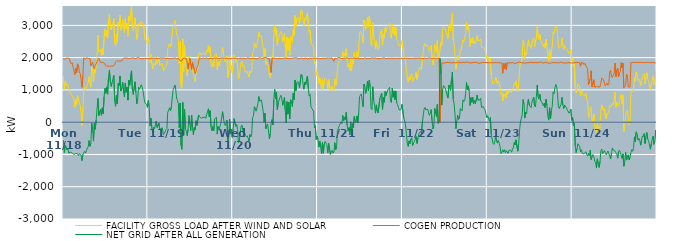
| Category | FACILITY GROSS LOAD AFTER WIND AND SOLAR | COGEN PRODUCTION | NET GRID AFTER ALL GENERATION |
|---|---|---|---|
|  Mon  11/18 | 1417 | 1982 | -565 |
|  Mon  11/18 | 1003 | 1946 | -943 |
|  Mon  11/18 | 1257 | 1965 | -708 |
|  Mon  11/18 | 1280 | 1978 | -698 |
|  Mon  11/18 | 1140 | 2000 | -860 |
|  Mon  11/18 | 1173 | 1989 | -816 |
|  Mon  11/18 | 1040 | 1997 | -957 |
|  Mon  11/18 | 981 | 1967 | -986 |
|  Mon  11/18 | 898 | 1826 | -928 |
|  Mon  11/18 | 855 | 1796 | -941 |
|  Mon  11/18 | 876 | 1833 | -957 |
|  Mon  11/18 | 758 | 1698 | -940 |
|  Mon  11/18 | 679 | 1681 | -1002 |
|  Mon  11/18 | 462 | 1474 | -1012 |
|  Mon  11/18 | 700 | 1665 | -965 |
|  Mon  11/18 | 548 | 1539 | -991 |
|  Mon  11/18 | 828 | 1808 | -980 |
|  Mon  11/18 | 727 | 1765 | -1038 |
|  Mon  11/18 | 574 | 1553 | -979 |
|  Mon  11/18 | 520 | 1503 | -983 |
|  Mon  11/18 | 288 | 1310 | -1022 |
|  Mon  11/18 | -111 | 1080 | -1191 |
|  Mon  11/18 | 454 | 1449 | -995 |
|  Mon  11/18 | 999 | 1995 | -996 |
|  Mon  11/18 | 1068 | 1970 | -902 |
|  Mon  11/18 | 990 | 1948 | -958 |
|  Mon  11/18 | 1125 | 1997 | -872 |
|  Mon  11/18 | 1104 | 1977 | -873 |
|  Mon  11/18 | 1217 | 1976 | -759 |
|  Mon  11/18 | 1414 | 1984 | -570 |
|  Mon  11/18 | 1230 | 1977 | -747 |
|  Mon  11/18 | 1083 | 1743 | -660 |
|  Mon  11/18 | 1712 | 1739 | -27 |
|  Mon  11/18 | 1621 | 1854 | -233 |
|  Mon  11/18 | 1250 | 1838 | -588 |
|  Mon  11/18 | 1627 | 1651 | -24 |
|  Mon  11/18 | 1528 | 1751 | -223 |
|  Mon  11/18 | 1823 | 1757 | 66 |
|  Mon  11/18 | 1968 | 1877 | 91 |
|  Mon  11/18 | 2692 | 1955 | 737 |
|  Mon  11/18 | 2190 | 1986 | 204 |
|  Mon  11/18 | 2210 | 2000 | 210 |
|  Mon  11/18 | 2239 | 1845 | 394 |
|  Mon  11/18 | 2053 | 1839 | 214 |
|  Mon  11/18 | 2301 | 1855 | 446 |
|  Mon  11/18 | 2085 | 1830 | 255 |
|  Mon  11/18 | 2626 | 1834 | 792 |
|  Mon  11/18 | 2887 | 1832 | 1055 |
|  Mon  11/18 | 2639 | 1745 | 894 |
|  Mon  11/18 | 2841 | 1748 | 1093 |
|  Mon  11/18 | 2601 | 1734 | 867 |
|  Mon  11/18 | 3139 | 1751 | 1388 |
|  Mon  11/18 | 3351 | 1733 | 1618 |
|  Mon  11/18 | 2989 | 1744 | 1245 |
|  Mon  11/18 | 2852 | 1744 | 1108 |
|  Mon  11/18 | 2975 | 1748 | 1227 |
|  Mon  11/18 | 3071 | 1737 | 1334 |
|  Mon  11/18 | 3208 | 1759 | 1449 |
|  Mon  11/18 | 2450 | 1786 | 664 |
|  Mon  11/18 | 2361 | 1868 | 493 |
|  Mon  11/18 | 2737 | 1901 | 836 |
|  Mon  11/18 | 2457 | 1893 | 564 |
|  Mon  11/18 | 3098 | 1896 | 1202 |
|  Mon  11/18 | 3027 | 1892 | 1135 |
|  Mon  11/18 | 3323 | 1890 | 1433 |
|  Mon  11/18 | 2852 | 1887 | 965 |
|  Mon  11/18 | 2943 | 1895 | 1048 |
|  Mon  11/18 | 3191 | 1948 | 1243 |
|  Mon  11/18 | 2927 | 1984 | 943 |
|  Mon  11/18 | 2778 | 1991 | 787 |
|  Mon  11/18 | 3205 | 1990 | 1215 |
|  Mon  11/18 | 2895 | 1968 | 927 |
|  Mon  11/18 | 3071 | 1982 | 1089 |
|  Mon  11/18 | 2664 | 1981 | 683 |
|  Mon  11/18 | 3279 | 1974 | 1305 |
|  Mon  11/18 | 3134 | 1986 | 1148 |
|  Mon  11/18 | 3116 | 1979 | 1137 |
|  Mon  11/18 | 3580 | 1988 | 1592 |
|  Mon  11/18 | 2981 | 1995 | 986 |
|  Mon  11/18 | 2840 | 1981 | 859 |
|  Mon  11/18 | 2868 | 1982 | 886 |
|  Mon  11/18 | 3238 | 1987 | 1251 |
|  Mon  11/18 | 2894 | 1971 | 923 |
|  Mon  11/18 | 2559 | 1989 | 570 |
|  Mon  11/18 | 2720 | 2010 | 710 |
|  Mon  11/18 | 3063 | 1985 | 1078 |
|  Mon  11/18 | 3001 | 1980 | 1021 |
|  Mon  11/18 | 2979 | 1980 | 999 |
|  Mon  11/18 | 3130 | 1970 | 1160 |
|  Mon  11/18 | 3083 | 1996 | 1087 |
|  Mon  11/18 | 2940 | 1966 | 974 |
|  Mon  11/18 | 2993 | 1993 | 1000 |
|  Mon  11/18 | 2583 | 1976 | 607 |
|  Mon  11/18 | 2591 | 1984 | 607 |
|  Mon  11/18 | 2517 | 1970 | 547 |
|  Mon  11/18 | 2431 | 1973 | 458 |
|  Tue  11/19 | 2643 | 1976 | 667 |
|  Tue  11/19 | 2469 | 1976 | 493 |
|  Tue  11/19 | 1847 | 1963 | -116 |
|  Tue  11/19 | 2102 | 1978 | 124 |
|  Tue  11/19 | 1813 | 1981 | -168 |
|  Tue  11/19 | 1646 | 1975 | -329 |
|  Tue  11/19 | 1835 | 1990 | -155 |
|  Tue  11/19 | 1784 | 1985 | -201 |
|  Tue  11/19 | 1752 | 1977 | -225 |
|  Tue  11/19 | 2026 | 1989 | 37 |
|  Tue  11/19 | 1810 | 1975 | -165 |
|  Tue  11/19 | 1840 | 1979 | -139 |
|  Tue  11/19 | 1951 | 1980 | -29 |
|  Tue  11/19 | 1748 | 1984 | -236 |
|  Tue  11/19 | 1795 | 1991 | -196 |
|  Tue  11/19 | 1793 | 1994 | -201 |
|  Tue  11/19 | 1815 | 1990 | -175 |
|  Tue  11/19 | 1585 | 1973 | -388 |
|  Tue  11/19 | 1598 | 1990 | -392 |
|  Tue  11/19 | 1688 | 1980 | -292 |
|  Tue  11/19 | 1741 | 1974 | -233 |
|  Tue  11/19 | 1772 | 1970 | -198 |
|  Tue  11/19 | 2287 | 1976 | 311 |
|  Tue  11/19 | 2351 | 1981 | 370 |
|  Tue  11/19 | 2424 | 1978 | 446 |
|  Tue  11/19 | 2327 | 1975 | 352 |
|  Tue  11/19 | 2444 | 1977 | 467 |
|  Tue  11/19 | 2457 | 1991 | 466 |
|  Tue  11/19 | 2972 | 1980 | 992 |
|  Tue  11/19 | 3050 | 1990 | 1060 |
|  Tue  11/19 | 3149 | 1996 | 1153 |
|  Tue  11/19 | 2999 | 1978 | 1021 |
|  Tue  11/19 | 2718 | 1971 | 747 |
|  Tue  11/19 | 2649 | 1977 | 672 |
|  Tue  11/19 | 2571 | 1985 | 586 |
|  Tue  11/19 | 1815 | 1987 | -172 |
|  Tue  11/19 | 2493 | 1901 | 592 |
|  Tue  11/19 | 1156 | 1872 | -716 |
|  Tue  11/19 | 1054 | 1896 | -842 |
|  Tue  11/19 | 2581 | 1969 | 612 |
|  Tue  11/19 | 1564 | 1974 | -410 |
|  Tue  11/19 | 2385 | 1981 | 404 |
|  Tue  11/19 | 1775 | 1977 | -202 |
|  Tue  11/19 | 1698 | 1978 | -280 |
|  Tue  11/19 | 1425 | 1841 | -416 |
|  Tue  11/19 | 1420 | 1644 | -224 |
|  Tue  11/19 | 2051 | 1847 | 204 |
|  Tue  11/19 | 1933 | 1982 | -49 |
|  Tue  11/19 | 1727 | 1990 | -263 |
|  Tue  11/19 | 1857 | 1638 | 219 |
|  Tue  11/19 | 1686 | 1846 | -160 |
|  Tue  11/19 | 1464 | 1848 | -384 |
|  Tue  11/19 | 1461 | 1626 | -165 |
|  Tue  11/19 | 1263 | 1502 | -239 |
|  Tue  11/19 | 1627 | 1583 | 44 |
|  Tue  11/19 | 1599 | 1697 | -98 |
|  Tue  11/19 | 1655 | 1746 | -91 |
|  Tue  11/19 | 2117 | 1893 | 224 |
|  Tue  11/19 | 2163 | 1996 | 167 |
|  Tue  11/19 | 2133 | 1989 | 144 |
|  Tue  11/19 | 2088 | 1969 | 119 |
|  Tue  11/19 | 2134 | 1995 | 139 |
|  Tue  11/19 | 2140 | 1992 | 148 |
|  Tue  11/19 | 2139 | 1990 | 149 |
|  Tue  11/19 | 2135 | 1976 | 159 |
|  Tue  11/19 | 2083 | 1964 | 119 |
|  Tue  11/19 | 2220 | 1988 | 232 |
|  Tue  11/19 | 2184 | 1969 | 215 |
|  Tue  11/19 | 2391 | 1975 | 416 |
|  Tue  11/19 | 2154 | 1988 | 166 |
|  Tue  11/19 | 2336 | 1979 | 357 |
|  Tue  11/19 | 1829 | 1980 | -151 |
|  Tue  11/19 | 1714 | 1978 | -264 |
|  Tue  11/19 | 1841 | 1978 | -137 |
|  Tue  11/19 | 1721 | 1983 | -262 |
|  Tue  11/19 | 2073 | 1983 | 90 |
|  Tue  11/19 | 2098 | 1987 | 111 |
|  Tue  11/19 | 2136 | 1980 | 156 |
|  Tue  11/19 | 1615 | 1985 | -370 |
|  Tue  11/19 | 1855 | 1983 | -128 |
|  Tue  11/19 | 1744 | 1971 | -227 |
|  Tue  11/19 | 1839 | 1978 | -139 |
|  Tue  11/19 | 1942 | 1984 | -42 |
|  Tue  11/19 | 2135 | 1988 | 147 |
|  Tue  11/19 | 2316 | 1992 | 324 |
|  Tue  11/19 | 2107 | 1976 | 131 |
|  Tue  11/19 | 1947 | 1982 | -35 |
|  Tue  11/19 | 1872 | 1975 | -103 |
|  Tue  11/19 | 1878 | 1984 | -106 |
|  Tue  11/19 | 2052 | 1991 | 61 |
|  Tue  11/19 | 1368 | 1973 | -605 |
|  Tue  11/19 | 1545 | 1993 | -448 |
|  Tue  11/19 | 2067 | 1969 | 98 |
|  Tue  11/19 | 1623 | 1980 | -357 |
|  Tue  11/19 | 1749 | 1974 | -225 |
|  Tue  11/19 | 1526 | 1996 | -470 |
|  Wed  11/20 | 1787 | 1986 | -199 |
|  Wed  11/20 | 2086 | 1974 | 112 |
|  Wed  11/20 | 2078 | 1976 | 102 |
|  Wed  11/20 | 1860 | 1992 | -132 |
|  Wed  11/20 | 1918 | 1987 | -69 |
|  Wed  11/20 | 1767 | 1995 | -228 |
|  Wed  11/20 | 1337 | 1971 | -634 |
|  Wed  11/20 | 1385 | 1971 | -586 |
|  Wed  11/20 | 1664 | 1986 | -322 |
|  Wed  11/20 | 1847 | 1977 | -130 |
|  Wed  11/20 | 1891 | 1978 | -87 |
|  Wed  11/20 | 1709 | 1975 | -266 |
|  Wed  11/20 | 1752 | 1985 | -233 |
|  Wed  11/20 | 1766 | 1974 | -208 |
|  Wed  11/20 | 1549 | 1964 | -415 |
|  Wed  11/20 | 1527 | 1982 | -455 |
|  Wed  11/20 | 1573 | 1995 | -422 |
|  Wed  11/20 | 1586 | 1980 | -394 |
|  Wed  11/20 | 1399 | 1985 | -586 |
|  Wed  11/20 | 1591 | 1975 | -384 |
|  Wed  11/20 | 1523 | 1974 | -451 |
|  Wed  11/20 | 1607 | 1968 | -361 |
|  Wed  11/20 | 2119 | 1974 | 145 |
|  Wed  11/20 | 2187 | 1987 | 200 |
|  Wed  11/20 | 2458 | 1980 | 478 |
|  Wed  11/20 | 2377 | 1969 | 408 |
|  Wed  11/20 | 2305 | 1965 | 340 |
|  Wed  11/20 | 2314 | 1970 | 344 |
|  Wed  11/20 | 2539 | 1973 | 566 |
|  Wed  11/20 | 2783 | 1988 | 795 |
|  Wed  11/20 | 2657 | 2004 | 653 |
|  Wed  11/20 | 2660 | 1988 | 672 |
|  Wed  11/20 | 2666 | 1977 | 689 |
|  Wed  11/20 | 2658 | 1985 | 673 |
|  Wed  11/20 | 2308 | 1983 | 325 |
|  Wed  11/20 | 1971 | 1969 | 2 |
|  Wed  11/20 | 2280 | 2005 | 275 |
|  Wed  11/20 | 1790 | 1993 | -203 |
|  Wed  11/20 | 1884 | 1998 | -114 |
|  Wed  11/20 | 1907 | 1967 | -60 |
|  Wed  11/20 | 1705 | 1975 | -270 |
|  Wed  11/20 | 1449 | 1967 | -518 |
|  Wed  11/20 | 1374 | 1736 | -362 |
|  Wed  11/20 | 1533 | 1542 | -9 |
|  Wed  11/20 | 2056 | 1976 | 80 |
|  Wed  11/20 | 1906 | 1994 | -88 |
|  Wed  11/20 | 2678 | 1985 | 693 |
|  Wed  11/20 | 2999 | 1981 | 1018 |
|  Wed  11/20 | 2694 | 1975 | 719 |
|  Wed  11/20 | 2903 | 1976 | 927 |
|  Wed  11/20 | 2361 | 1976 | 385 |
|  Wed  11/20 | 2574 | 1970 | 604 |
|  Wed  11/20 | 2568 | 1980 | 588 |
|  Wed  11/20 | 2753 | 1985 | 768 |
|  Wed  11/20 | 2808 | 1974 | 834 |
|  Wed  11/20 | 2740 | 1990 | 750 |
|  Wed  11/20 | 2500 | 1979 | 521 |
|  Wed  11/20 | 2629 | 1986 | 643 |
|  Wed  11/20 | 2751 | 1985 | 766 |
|  Wed  11/20 | 2341 | 1985 | 356 |
|  Wed  11/20 | 1964 | 1982 | -18 |
|  Wed  11/20 | 2641 | 2004 | 637 |
|  Wed  11/20 | 2222 | 1975 | 247 |
|  Wed  11/20 | 2601 | 1979 | 622 |
|  Wed  11/20 | 2073 | 1975 | 98 |
|  Wed  11/20 | 2665 | 1970 | 695 |
|  Wed  11/20 | 2613 | 1980 | 633 |
|  Wed  11/20 | 2455 | 1975 | 480 |
|  Wed  11/20 | 2884 | 1983 | 901 |
|  Wed  11/20 | 2686 | 1985 | 701 |
|  Wed  11/20 | 3303 | 1998 | 1305 |
|  Wed  11/20 | 2963 | 1985 | 978 |
|  Wed  11/20 | 3215 | 1995 | 1220 |
|  Wed  11/20 | 3256 | 1995 | 1261 |
|  Wed  11/20 | 3191 | 1967 | 1224 |
|  Wed  11/20 | 3052 | 1980 | 1072 |
|  Wed  11/20 | 3045 | 1980 | 1065 |
|  Wed  11/20 | 3479 | 1992 | 1487 |
|  Wed  11/20 | 3436 | 1983 | 1453 |
|  Wed  11/20 | 3174 | 1976 | 1198 |
|  Wed  11/20 | 2991 | 1969 | 1022 |
|  Wed  11/20 | 3224 | 1981 | 1243 |
|  Wed  11/20 | 3150 | 1990 | 1160 |
|  Wed  11/20 | 3165 | 1996 | 1169 |
|  Wed  11/20 | 3387 | 1959 | 1428 |
|  Wed  11/20 | 3046 | 1984 | 1062 |
|  Wed  11/20 | 2785 | 1976 | 809 |
|  Wed  11/20 | 2852 | 1990 | 862 |
|  Wed  11/20 | 2456 | 1981 | 475 |
|  Wed  11/20 | 2403 | 1977 | 426 |
|  Wed  11/20 | 2413 | 1981 | 432 |
|  Wed  11/20 | 2316 | 1979 | 337 |
|  Wed  11/20 | 1806 | 1988 | -182 |
|  Wed  11/20 | 1871 | 1983 | -112 |
|  Wed  11/20 | 1442 | 1978 | -536 |
|  Wed  11/20 | 1564 | 1996 | -432 |
|  Thu  11/21 | 1451 | 1984 | -533 |
|  Thu  11/21 | 1200 | 1971 | -771 |
|  Thu  11/21 | 1379 | 1973 | -594 |
|  Thu  11/21 | 1204 | 1964 | -760 |
|  Thu  11/21 | 1004 | 1973 | -969 |
|  Thu  11/21 | 1338 | 1970 | -632 |
|  Thu  11/21 | 1024 | 1986 | -962 |
|  Thu  11/21 | 1294 | 1970 | -676 |
|  Thu  11/21 | 1378 | 1976 | -598 |
|  Thu  11/21 | 1382 | 1970 | -588 |
|  Thu  11/21 | 1293 | 1988 | -695 |
|  Thu  11/21 | 1032 | 1981 | -949 |
|  Thu  11/21 | 1333 | 1985 | -652 |
|  Thu  11/21 | 1338 | 1984 | -646 |
|  Thu  11/21 | 993 | 1988 | -995 |
|  Thu  11/21 | 1041 | 1978 | -937 |
|  Thu  11/21 | 1115 | 1989 | -874 |
|  Thu  11/21 | 1009 | 1966 | -957 |
|  Thu  11/21 | 956 | 1882 | -926 |
|  Thu  11/21 | 1347 | 1982 | -635 |
|  Thu  11/21 | 1133 | 1985 | -852 |
|  Thu  11/21 | 1210 | 1970 | -760 |
|  Thu  11/21 | 1705 | 1962 | -257 |
|  Thu  11/21 | 1820 | 2004 | -184 |
|  Thu  11/21 | 1874 | 1985 | -111 |
|  Thu  11/21 | 1941 | 1995 | -54 |
|  Thu  11/21 | 1982 | 1979 | 3 |
|  Thu  11/21 | 1921 | 1968 | -47 |
|  Thu  11/21 | 2185 | 1976 | 209 |
|  Thu  11/21 | 2030 | 1985 | 45 |
|  Thu  11/21 | 2127 | 1976 | 151 |
|  Thu  11/21 | 2054 | 1986 | 68 |
|  Thu  11/21 | 2279 | 1970 | 309 |
|  Thu  11/21 | 1889 | 1994 | -105 |
|  Thu  11/21 | 1717 | 1992 | -275 |
|  Thu  11/21 | 1811 | 1980 | -169 |
|  Thu  11/21 | 1594 | 1983 | -389 |
|  Thu  11/21 | 1994 | 1984 | 10 |
|  Thu  11/21 | 1601 | 1980 | -379 |
|  Thu  11/21 | 1939 | 1982 | -43 |
|  Thu  11/21 | 1806 | 1979 | -173 |
|  Thu  11/21 | 2161 | 1987 | 174 |
|  Thu  11/21 | 2014 | 1966 | 48 |
|  Thu  11/21 | 1973 | 1982 | -9 |
|  Thu  11/21 | 2183 | 1988 | 195 |
|  Thu  11/21 | 1952 | 1960 | -8 |
|  Thu  11/21 | 2261 | 2001 | 260 |
|  Thu  11/21 | 2759 | 1966 | 793 |
|  Thu  11/21 | 2825 | 1988 | 837 |
|  Thu  11/21 | 2853 | 1978 | 875 |
|  Thu  11/21 | 2647 | 1976 | 671 |
|  Thu  11/21 | 2447 | 1967 | 480 |
|  Thu  11/21 | 3164 | 1988 | 1176 |
|  Thu  11/21 | 3108 | 1993 | 1115 |
|  Thu  11/21 | 2875 | 1980 | 895 |
|  Thu  11/21 | 3026 | 1975 | 1051 |
|  Thu  11/21 | 3248 | 1971 | 1277 |
|  Thu  11/21 | 2946 | 1979 | 967 |
|  Thu  11/21 | 3287 | 1984 | 1303 |
|  Thu  11/21 | 3079 | 1975 | 1104 |
|  Thu  11/21 | 2414 | 1988 | 426 |
|  Thu  11/21 | 2382 | 1993 | 389 |
|  Thu  11/21 | 3081 | 1981 | 1100 |
|  Thu  11/21 | 2662 | 1985 | 677 |
|  Thu  11/21 | 2498 | 1979 | 519 |
|  Thu  11/21 | 2268 | 1988 | 280 |
|  Thu  11/21 | 2521 | 1983 | 538 |
|  Thu  11/21 | 2326 | 1975 | 351 |
|  Thu  11/21 | 2251 | 1965 | 286 |
|  Thu  11/21 | 2284 | 1974 | 310 |
|  Thu  11/21 | 2723 | 1976 | 747 |
|  Thu  11/21 | 2712 | 1971 | 741 |
|  Thu  11/21 | 2869 | 1971 | 898 |
|  Thu  11/21 | 2383 | 1985 | 398 |
|  Thu  11/21 | 2734 | 1971 | 763 |
|  Thu  11/21 | 2615 | 1998 | 617 |
|  Thu  11/21 | 2937 | 1985 | 952 |
|  Thu  11/21 | 2790 | 1963 | 827 |
|  Thu  11/21 | 2902 | 1973 | 929 |
|  Thu  11/21 | 2978 | 1980 | 998 |
|  Thu  11/21 | 2963 | 1981 | 982 |
|  Thu  11/21 | 3059 | 1978 | 1081 |
|  Thu  11/21 | 2641 | 1981 | 660 |
|  Thu  11/21 | 2590 | 1982 | 608 |
|  Thu  11/21 | 3038 | 1983 | 1055 |
|  Thu  11/21 | 2751 | 1980 | 771 |
|  Thu  11/21 | 2951 | 1981 | 970 |
|  Thu  11/21 | 2680 | 1981 | 699 |
|  Thu  11/21 | 2954 | 1987 | 967 |
|  Thu  11/21 | 2573 | 1976 | 597 |
|  Thu  11/21 | 2519 | 1975 | 544 |
|  Thu  11/21 | 2431 | 1981 | 450 |
|  Thu  11/21 | 2359 | 1986 | 373 |
|  Thu  11/21 | 2347 | 1980 | 367 |
|  Thu  11/21 | 2364 | 1971 | 393 |
|  Thu  11/21 | 2534 | 1980 | 554 |
|  Fri  11/22 | 2551 | 1974 | 577 |
|  Fri  11/22 | 2110 | 1977 | 133 |
|  Fri  11/22 | 2012 | 1975 | 37 |
|  Fri  11/22 | 1904 | 1981 | -77 |
|  Fri  11/22 | 1616 | 1980 | -364 |
|  Fri  11/22 | 1334 | 1980 | -646 |
|  Fri  11/22 | 1236 | 1986 | -750 |
|  Fri  11/22 | 1401 | 1980 | -579 |
|  Fri  11/22 | 1314 | 1977 | -663 |
|  Fri  11/22 | 1451 | 1975 | -524 |
|  Fri  11/22 | 1498 | 1981 | -483 |
|  Fri  11/22 | 1257 | 1978 | -721 |
|  Fri  11/22 | 1348 | 1992 | -644 |
|  Fri  11/22 | 1377 | 1983 | -606 |
|  Fri  11/22 | 1380 | 1988 | -608 |
|  Fri  11/22 | 1538 | 1981 | -443 |
|  Fri  11/22 | 1318 | 1977 | -659 |
|  Fri  11/22 | 1495 | 1984 | -489 |
|  Fri  11/22 | 1607 | 1981 | -374 |
|  Fri  11/22 | 1675 | 1990 | -315 |
|  Fri  11/22 | 1710 | 1984 | -274 |
|  Fri  11/22 | 1630 | 1972 | -342 |
|  Fri  11/22 | 1950 | 1977 | -27 |
|  Fri  11/22 | 2164 | 1970 | 194 |
|  Fri  11/22 | 2383 | 1982 | 401 |
|  Fri  11/22 | 2444 | 1985 | 459 |
|  Fri  11/22 | 2364 | 1981 | 383 |
|  Fri  11/22 | 2363 | 1975 | 388 |
|  Fri  11/22 | 2392 | 1986 | 406 |
|  Fri  11/22 | 2379 | 1989 | 390 |
|  Fri  11/22 | 2192 | 1980 | 212 |
|  Fri  11/22 | 2273 | 1994 | 279 |
|  Fri  11/22 | 2379 | 1989 | 390 |
|  Fri  11/22 | 2019 | 1968 | 51 |
|  Fri  11/22 | 1775 | 1982 | -207 |
|  Fri  11/22 | 1857 | 1984 | -127 |
|  Fri  11/22 | 2404 | 1976 | 428 |
|  Fri  11/22 | 2264 | 1977 | 287 |
|  Fri  11/22 | 2165 | 1990 | 175 |
|  Fri  11/22 | 2524 | 1972 | 552 |
|  Fri  11/22 | 1931 | 1968 | -37 |
|  Fri  11/22 | 1979 | 1969 | 10 |
|  Fri  11/22 | 1977 | 0 | 1977 |
|  Fri  11/22 | 2476 | 992 | 1484 |
|  Fri  11/22 | 2365 | 1837 | 528 |
|  Fri  11/22 | 2866 | 1860 | 1006 |
|  Fri  11/22 | 2962 | 1828 | 1134 |
|  Fri  11/22 | 2958 | 1842 | 1116 |
|  Fri  11/22 | 2891 | 1841 | 1050 |
|  Fri  11/22 | 2870 | 1848 | 1022 |
|  Fri  11/22 | 2695 | 1853 | 842 |
|  Fri  11/22 | 2589 | 1844 | 745 |
|  Fri  11/22 | 2998 | 1848 | 1150 |
|  Fri  11/22 | 2930 | 1859 | 1071 |
|  Fri  11/22 | 2822 | 1843 | 979 |
|  Fri  11/22 | 3171 | 1845 | 1326 |
|  Fri  11/22 | 3387 | 1835 | 1552 |
|  Fri  11/22 | 2543 | 1842 | 701 |
|  Fri  11/22 | 2419 | 1857 | 562 |
|  Fri  11/22 | 2059 | 1828 | 231 |
|  Fri  11/22 | 1636 | 1835 | -199 |
|  Fri  11/22 | 1868 | 1840 | 28 |
|  Fri  11/22 | 2070 | 1859 | 211 |
|  Fri  11/22 | 1937 | 1851 | 86 |
|  Fri  11/22 | 1971 | 1850 | 121 |
|  Fri  11/22 | 2270 | 1848 | 422 |
|  Fri  11/22 | 2225 | 1840 | 385 |
|  Fri  11/22 | 2199 | 1846 | 353 |
|  Fri  11/22 | 2554 | 1862 | 692 |
|  Fri  11/22 | 2487 | 1847 | 640 |
|  Fri  11/22 | 2511 | 1840 | 671 |
|  Fri  11/22 | 2749 | 1860 | 889 |
|  Fri  11/22 | 3092 | 1863 | 1229 |
|  Fri  11/22 | 2856 | 1847 | 1009 |
|  Fri  11/22 | 2975 | 1850 | 1125 |
|  Fri  11/22 | 2798 | 1832 | 966 |
|  Fri  11/22 | 2348 | 1834 | 514 |
|  Fri  11/22 | 2596 | 1833 | 763 |
|  Fri  11/22 | 2456 | 1843 | 613 |
|  Fri  11/22 | 2619 | 1847 | 772 |
|  Fri  11/22 | 2422 | 1852 | 570 |
|  Fri  11/22 | 2509 | 1841 | 668 |
|  Fri  11/22 | 2428 | 1853 | 575 |
|  Fri  11/22 | 2552 | 1841 | 711 |
|  Fri  11/22 | 2689 | 1846 | 843 |
|  Fri  11/22 | 2517 | 1836 | 681 |
|  Fri  11/22 | 2537 | 1826 | 711 |
|  Fri  11/22 | 2531 | 1845 | 686 |
|  Fri  11/22 | 2579 | 1839 | 740 |
|  Fri  11/22 | 2316 | 1860 | 456 |
|  Fri  11/22 | 2297 | 1848 | 449 |
|  Fri  11/22 | 2316 | 1831 | 485 |
|  Fri  11/22 | 2272 | 1849 | 423 |
|  Fri  11/22 | 2241 | 1854 | 387 |
|  Fri  11/22 | 2103 | 1848 | 255 |
|  Fri  11/22 | 1972 | 1839 | 133 |
|  Sat  11/23 | 2049 | 1848 | 201 |
|  Sat  11/23 | 2052 | 1849 | 203 |
|  Sat  11/23 | 1864 | 1834 | 30 |
|  Sat  11/23 | 1979 | 1839 | 140 |
|  Sat  11/23 | 1458 | 1848 | -390 |
|  Sat  11/23 | 1315 | 1826 | -511 |
|  Sat  11/23 | 1179 | 1837 | -658 |
|  Sat  11/23 | 1156 | 1845 | -689 |
|  Sat  11/23 | 1237 | 1847 | -610 |
|  Sat  11/23 | 1397 | 1845 | -448 |
|  Sat  11/23 | 1405 | 1845 | -440 |
|  Sat  11/23 | 1199 | 1846 | -647 |
|  Sat  11/23 | 1276 | 1844 | -568 |
|  Sat  11/23 | 1188 | 1843 | -655 |
|  Sat  11/23 | 1074 | 1839 | -765 |
|  Sat  11/23 | 863 | 1839 | -976 |
|  Sat  11/23 | 913 | 1839 | -926 |
|  Sat  11/23 | 663 | 1517 | -854 |
|  Sat  11/23 | 893 | 1821 | -928 |
|  Sat  11/23 | 807 | 1660 | -853 |
|  Sat  11/23 | 887 | 1836 | -949 |
|  Sat  11/23 | 743 | 1625 | -882 |
|  Sat  11/23 | 985 | 1838 | -853 |
|  Sat  11/23 | 879 | 1849 | -970 |
|  Sat  11/23 | 966 | 1838 | -872 |
|  Sat  11/23 | 952 | 1843 | -891 |
|  Sat  11/23 | 966 | 1835 | -869 |
|  Sat  11/23 | 921 | 1853 | -932 |
|  Sat  11/23 | 1012 | 1846 | -834 |
|  Sat  11/23 | 1071 | 1862 | -791 |
|  Sat  11/23 | 1200 | 1827 | -627 |
|  Sat  11/23 | 1152 | 1857 | -705 |
|  Sat  11/23 | 1280 | 1827 | -547 |
|  Sat  11/23 | 1283 | 1850 | -567 |
|  Sat  11/23 | 951 | 1850 | -899 |
|  Sat  11/23 | 1164 | 1849 | -685 |
|  Sat  11/23 | 1603 | 1858 | -255 |
|  Sat  11/23 | 1852 | 1847 | 5 |
|  Sat  11/23 | 1820 | 1842 | -22 |
|  Sat  11/23 | 2078 | 1851 | 227 |
|  Sat  11/23 | 2540 | 1837 | 703 |
|  Sat  11/23 | 2398 | 1855 | 543 |
|  Sat  11/23 | 1959 | 1832 | 127 |
|  Sat  11/23 | 2150 | 1838 | 312 |
|  Sat  11/23 | 2104 | 1840 | 264 |
|  Sat  11/23 | 2411 | 1832 | 579 |
|  Sat  11/23 | 2552 | 1841 | 711 |
|  Sat  11/23 | 2357 | 1828 | 529 |
|  Sat  11/23 | 2404 | 1849 | 555 |
|  Sat  11/23 | 2288 | 1837 | 451 |
|  Sat  11/23 | 2476 | 1854 | 622 |
|  Sat  11/23 | 2570 | 1859 | 711 |
|  Sat  11/23 | 2614 | 1839 | 775 |
|  Sat  11/23 | 2338 | 1836 | 502 |
|  Sat  11/23 | 2321 | 1850 | 471 |
|  Sat  11/23 | 2624 | 1833 | 791 |
|  Sat  11/23 | 2989 | 1840 | 1149 |
|  Sat  11/23 | 2639 | 1855 | 784 |
|  Sat  11/23 | 2556 | 1845 | 711 |
|  Sat  11/23 | 2711 | 1844 | 867 |
|  Sat  11/23 | 2531 | 1868 | 663 |
|  Sat  11/23 | 2488 | 1857 | 631 |
|  Sat  11/23 | 2396 | 1836 | 560 |
|  Sat  11/23 | 2346 | 1842 | 504 |
|  Sat  11/23 | 2432 | 1840 | 592 |
|  Sat  11/23 | 2289 | 1839 | 450 |
|  Sat  11/23 | 2571 | 1859 | 712 |
|  Sat  11/23 | 2371 | 1851 | 520 |
|  Sat  11/23 | 2024 | 1830 | 194 |
|  Sat  11/23 | 1910 | 1847 | 63 |
|  Sat  11/23 | 2272 | 1825 | 447 |
|  Sat  11/23 | 1949 | 1840 | 109 |
|  Sat  11/23 | 2196 | 1836 | 360 |
|  Sat  11/23 | 2354 | 1857 | 497 |
|  Sat  11/23 | 2789 | 1849 | 940 |
|  Sat  11/23 | 2749 | 1866 | 883 |
|  Sat  11/23 | 2906 | 1839 | 1067 |
|  Sat  11/23 | 2993 | 1820 | 1173 |
|  Sat  11/23 | 2940 | 1852 | 1088 |
|  Sat  11/23 | 2713 | 1833 | 880 |
|  Sat  11/23 | 2292 | 1829 | 463 |
|  Sat  11/23 | 2265 | 1842 | 423 |
|  Sat  11/23 | 2357 | 1857 | 500 |
|  Sat  11/23 | 2395 | 1839 | 556 |
|  Sat  11/23 | 2618 | 1849 | 769 |
|  Sat  11/23 | 2363 | 1837 | 526 |
|  Sat  11/23 | 2256 | 1831 | 425 |
|  Sat  11/23 | 2371 | 1842 | 529 |
|  Sat  11/23 | 2356 | 1839 | 517 |
|  Sat  11/23 | 2282 | 1837 | 445 |
|  Sat  11/23 | 2219 | 1838 | 381 |
|  Sat  11/23 | 2201 | 1843 | 358 |
|  Sat  11/23 | 2125 | 1846 | 279 |
|  Sat  11/23 | 2177 | 1848 | 329 |
|  Sat  11/23 | 2242 | 1838 | 404 |
|  Sat  11/23 | 1909 | 1853 | 56 |
|  Sun  11/24 | 1991 | 1835 | 156 |
|  Sun  11/24 | 1718 | 1832 | -114 |
|  Sun  11/24 | 1802 | 1845 | -43 |
|  Sun  11/24 | 1099 | 1845 | -746 |
|  Sun  11/24 | 905 | 1846 | -941 |
|  Sun  11/24 | 1027 | 1845 | -818 |
|  Sun  11/24 | 1188 | 1854 | -666 |
|  Sun  11/24 | 1163 | 1839 | -676 |
|  Sun  11/24 | 1091 | 1842 | -751 |
|  Sun  11/24 | 812 | 1735 | -923 |
|  Sun  11/24 | 995 | 1850 | -855 |
|  Sun  11/24 | 889 | 1858 | -969 |
|  Sun  11/24 | 873 | 1836 | -963 |
|  Sun  11/24 | 801 | 1783 | -982 |
|  Sun  11/24 | 835 | 1824 | -989 |
|  Sun  11/24 | 909 | 1823 | -914 |
|  Sun  11/24 | 710 | 1697 | -987 |
|  Sun  11/24 | 606 | 1661 | -1055 |
|  Sun  11/24 | 194 | 1163 | -969 |
|  Sun  11/24 | 145 | 1183 | -1038 |
|  Sun  11/24 | 484 | 1346 | -862 |
|  Sun  11/24 | 437 | 1595 | -1158 |
|  Sun  11/24 | 21 | 1095 | -1074 |
|  Sun  11/24 | 100 | 1102 | -1002 |
|  Sun  11/24 | 255 | 1313 | -1058 |
|  Sun  11/24 | -119 | 1088 | -1207 |
|  Sun  11/24 | -143 | 1096 | -1239 |
|  Sun  11/24 | -314 | 1108 | -1422 |
|  Sun  11/24 | -45 | 1091 | -1136 |
|  Sun  11/24 | -187 | 1093 | -1280 |
|  Sun  11/24 | -320 | 1084 | -1404 |
|  Sun  11/24 | -144 | 1092 | -1236 |
|  Sun  11/24 | 332 | 1219 | -887 |
|  Sun  11/24 | 539 | 1370 | -831 |
|  Sun  11/24 | 403 | 1381 | -978 |
|  Sun  11/24 | 359 | 1314 | -955 |
|  Sun  11/24 | 433 | 1312 | -879 |
|  Sun  11/24 | 180 | 1120 | -940 |
|  Sun  11/24 | 100 | 1113 | -1013 |
|  Sun  11/24 | 257 | 1213 | -956 |
|  Sun  11/24 | 252 | 1148 | -896 |
|  Sun  11/24 | 317 | 1192 | -875 |
|  Sun  11/24 | 518 | 1566 | -1048 |
|  Sun  11/24 | 464 | 1605 | -1141 |
|  Sun  11/24 | 455 | 1419 | -964 |
|  Sun  11/24 | 585 | 1384 | -799 |
|  Sun  11/24 | 528 | 1390 | -862 |
|  Sun  11/24 | 638 | 1515 | -877 |
|  Sun  11/24 | 935 | 1830 | -895 |
|  Sun  11/24 | 458 | 1405 | -947 |
|  Sun  11/24 | 614 | 1611 | -997 |
|  Sun  11/24 | 561 | 1679 | -1118 |
|  Sun  11/24 | 495 | 1408 | -913 |
|  Sun  11/24 | 646 | 1510 | -864 |
|  Sun  11/24 | 630 | 1570 | -940 |
|  Sun  11/24 | 874 | 1843 | -969 |
|  Sun  11/24 | 560 | 1681 | -1121 |
|  Sun  11/24 | 850 | 1832 | -982 |
|  Sun  11/24 | -298 | 1067 | -1365 |
|  Sun  11/24 | -133 | 1084 | -1217 |
|  Sun  11/24 | 208 | 1131 | -923 |
|  Sun  11/24 | 315 | 1489 | -1174 |
|  Sun  11/24 | 367 | 1451 | -1084 |
|  Sun  11/24 | 86 | 1095 | -1009 |
|  Sun  11/24 | -80 | 1090 | -1170 |
|  Sun  11/24 | 10 | 1087 | -1077 |
|  Sun  11/24 | 913 | 1846 | -933 |
|  Sun  11/24 | 992 | 1844 | -852 |
|  Sun  11/24 | 945 | 1849 | -904 |
|  Sun  11/24 | 1064 | 1842 | -778 |
|  Sun  11/24 | 1394 | 1848 | -454 |
|  Sun  11/24 | 1251 | 1853 | -602 |
|  Sun  11/24 | 1552 | 1850 | -298 |
|  Sun  11/24 | 1481 | 1837 | -356 |
|  Sun  11/24 | 1292 | 1850 | -558 |
|  Sun  11/24 | 1336 | 1834 | -498 |
|  Sun  11/24 | 1284 | 1849 | -565 |
|  Sun  11/24 | 1126 | 1838 | -712 |
|  Sun  11/24 | 1294 | 1852 | -558 |
|  Sun  11/24 | 1408 | 1830 | -422 |
|  Sun  11/24 | 1386 | 1843 | -457 |
|  Sun  11/24 | 1500 | 1852 | -352 |
|  Sun  11/24 | 1186 | 1847 | -661 |
|  Sun  11/24 | 1412 | 1852 | -440 |
|  Sun  11/24 | 1537 | 1855 | -318 |
|  Sun  11/24 | 1321 | 1847 | -526 |
|  Sun  11/24 | 1273 | 1854 | -581 |
|  Sun  11/24 | 1263 | 1847 | -584 |
|  Sun  11/24 | 1001 | 1839 | -838 |
|  Sun  11/24 | 1178 | 1848 | -670 |
|  Sun  11/24 | 1178 | 1848 | -670 |
|  Sun  11/24 | 1412 | 1843 | -431 |
|  Sun  11/24 | 1161 | 1847 | -686 |
|  Sun  11/24 | 1234 | 1835 | -601 |
|  Sun  11/24 | 1582 | 1834 | -252 |
|  Sun  11/24 | 1295 | 1847 | -552 |